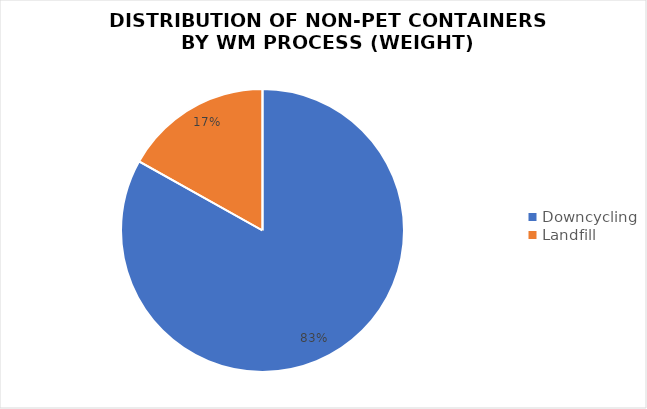
| Category | Series 0 |
|---|---|
| Downcycling | 44.83 |
| Landfill | 9.11 |